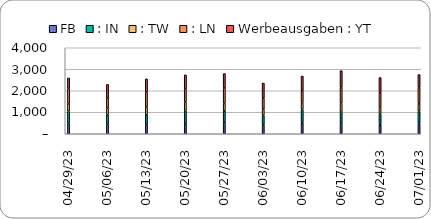
| Category | FB | : IN | : TW | : LN | Werbeausgaben : YT |
|---|---|---|---|---|---|
| 2023-07-01 | 481.26 | 566.315 | 343.782 | 759.153 | 601.018 |
| 2023-06-24 | 420.393 | 500.42 | 326.361 | 653.911 | 713.502 |
| 2023-06-17 | 501.076 | 511.207 | 407.833 | 730.177 | 784.294 |
| 2023-06-10 | 515.541 | 622.852 | 316.049 | 538.603 | 691.843 |
| 2023-06-03 | 407.038 | 447.656 | 286.056 | 514.031 | 703.627 |
| 2023-05-27 | 553.079 | 515.807 | 342.226 | 719.383 | 670.783 |
| 2023-05-20 | 470.365 | 613.373 | 390.649 | 601.249 | 663.602 |
| 2023-05-13 | 413.099 | 469.129 | 367.144 | 691.925 | 613.145 |
| 2023-05-06 | 427.467 | 464.107 | 293.12 | 486.369 | 624.964 |
| 2023-04-29 | 492.599 | 553.961 | 353.022 | 706.893 | 490.982 |